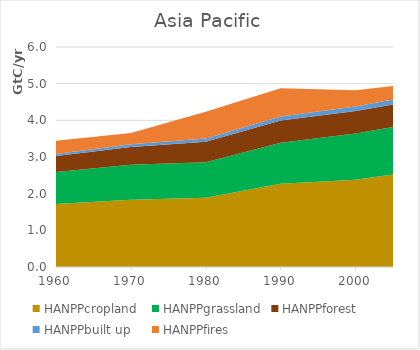
| Category | HANPPcropland | HANPPgrassland | HANPPforest | HANPPbuilt up | HANPPfires |
|---|---|---|---|---|---|
| 1960.0 | 1716486.617 | 872249.741 | 436238.298 | 57949.52 | 360888.417 |
| 1970.0 | 1833757.706 | 958142.676 | 480263.396 | 73495.366 | 310798.938 |
| 1980.0 | 1886541.649 | 973661.061 | 555242.827 | 86995.56 | 728850.543 |
| 1990.0 | 2269728.537 | 1116801.725 | 609648.342 | 106724.81 | 769819.489 |
| 2000.0 | 2380441.692 | 1260304.411 | 614469.656 | 123638.008 | 443633.777 |
| 2005.0 | 2520950.525 | 1296280.72 | 616161.83 | 135205.684 | 365810.306 |